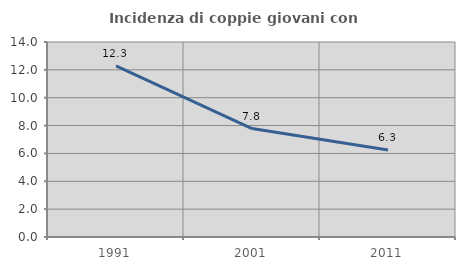
| Category | Incidenza di coppie giovani con figli |
|---|---|
| 1991.0 | 12.293 |
| 2001.0 | 7.784 |
| 2011.0 | 6.25 |